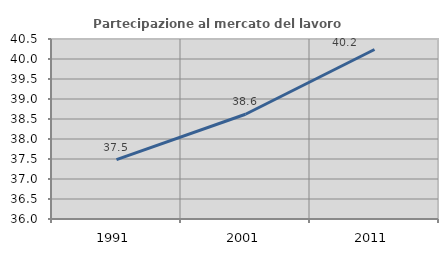
| Category | Partecipazione al mercato del lavoro  femminile |
|---|---|
| 1991.0 | 37.483 |
| 2001.0 | 38.619 |
| 2011.0 | 40.237 |